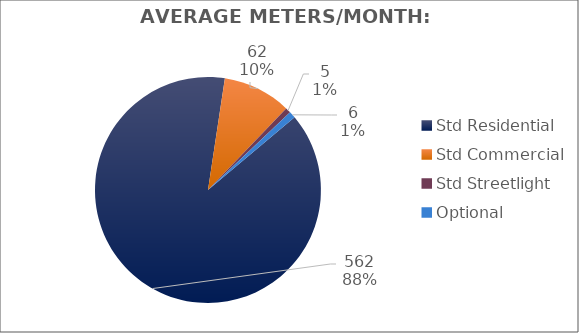
| Category | Meters |
|---|---|
| Std Residential | 562 |
| Std Commercial | 62 |
| Std Streetlight | 5 |
| Optional | 6 |